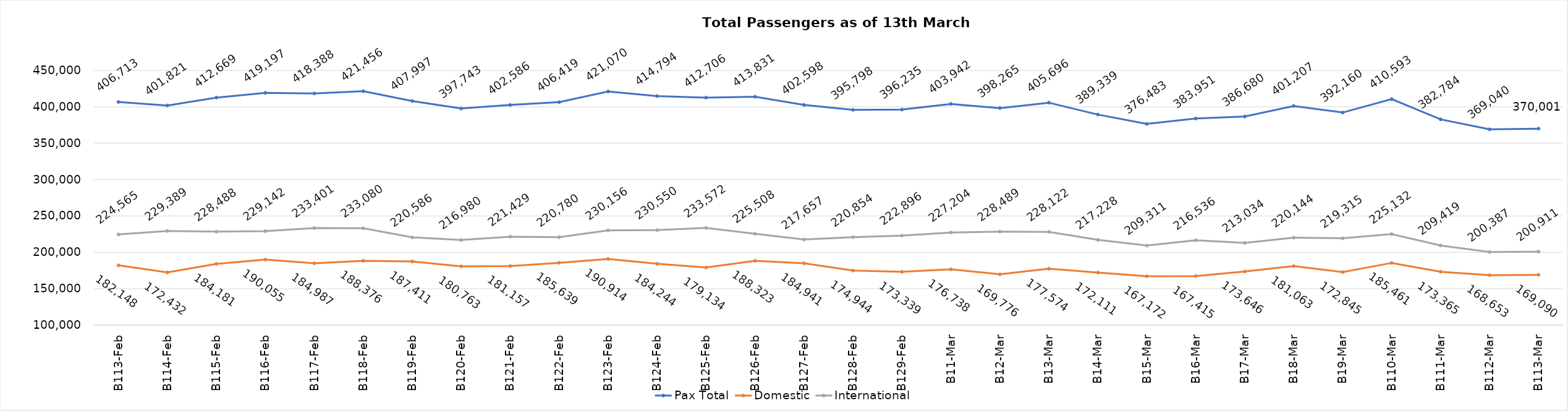
| Category | Pax Total | Domestic | International |
|---|---|---|---|
| 2024-02-13 | 406713 | 182148 | 224565 |
| 2024-02-14 | 401821 | 172432 | 229389 |
| 2024-02-15 | 412669 | 184181 | 228488 |
| 2024-02-16 | 419197 | 190055 | 229142 |
| 2024-02-17 | 418388 | 184987 | 233401 |
| 2024-02-18 | 421456 | 188376 | 233080 |
| 2024-02-19 | 407997 | 187411 | 220586 |
| 2024-02-20 | 397743 | 180763 | 216980 |
| 2024-02-21 | 402586 | 181157 | 221429 |
| 2024-02-22 | 406419 | 185639 | 220780 |
| 2024-02-23 | 421070 | 190914 | 230156 |
| 2024-02-24 | 414794 | 184244 | 230550 |
| 2024-02-25 | 412706 | 179134 | 233572 |
| 2024-02-26 | 413831 | 188323 | 225508 |
| 2024-02-27 | 402598 | 184941 | 217657 |
| 2024-02-28 | 395798 | 174944 | 220854 |
| 2024-02-29 | 396235 | 173339 | 222896 |
| 2024-03-01 | 403942 | 176738 | 227204 |
| 2024-03-02 | 398265 | 169776 | 228489 |
| 2024-03-03 | 405696 | 177574 | 228122 |
| 2024-03-04 | 389339 | 172111 | 217228 |
| 2024-03-05 | 376483 | 167172 | 209311 |
| 2024-03-06 | 383951 | 167415 | 216536 |
| 2024-03-07 | 386680 | 173646 | 213034 |
| 2024-03-08 | 401207 | 181063 | 220144 |
| 2024-03-09 | 392160 | 172845 | 219315 |
| 2024-03-10 | 410593 | 185461 | 225132 |
| 2024-03-11 | 382784 | 173365 | 209419 |
| 2024-03-12 | 369040 | 168653 | 200387 |
| 2024-03-13 | 370001 | 169090 | 200911 |